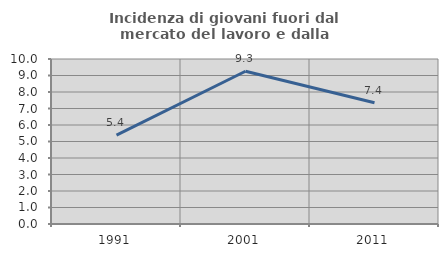
| Category | Incidenza di giovani fuori dal mercato del lavoro e dalla formazione  |
|---|---|
| 1991.0 | 5.385 |
| 2001.0 | 9.259 |
| 2011.0 | 7.353 |